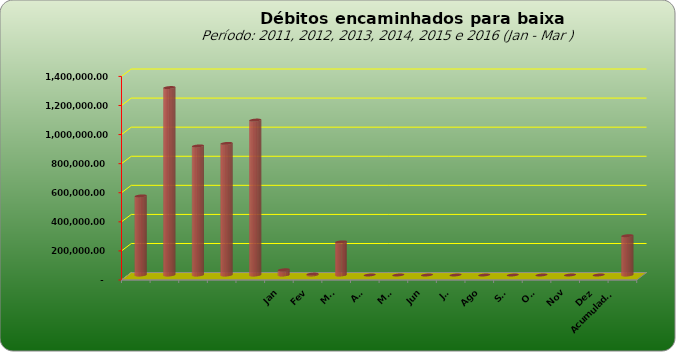
| Category |  543.796,20   1.289.053,69   887.573,08   905.052,31   1.065.434,28   35.964,03   6.417,54   227.804,72   -     -     -     -     -     -     -     -     -     270.186,29  |
|---|---|
|  | 543796.2 |
|  | 1289053.69 |
|  | 887573.08 |
|  | 905052.31 |
|  | 1065434.28 |
| Jan | 35964.03 |
| Fev | 6417.54 |
| Mar | 227804.72 |
| Abr | 0 |
| Mai | 0 |
| Jun | 0 |
| Jul | 0 |
| Ago | 0 |
| Set | 0 |
| Out | 0 |
| Nov | 0 |
| Dez | 0 |
| Acumulado
2016 | 270186.29 |